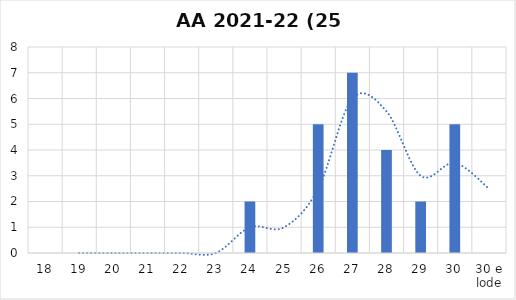
| Category | Series 0 |
|---|---|
| 18 | 0 |
| 19 | 0 |
| 20 | 0 |
| 21 | 0 |
| 22 | 0 |
| 23 | 0 |
| 24 | 2 |
| 25 | 0 |
| 26 | 5 |
| 27 | 7 |
| 28 | 4 |
| 29 | 2 |
| 30 | 5 |
| 30 e lode | 0 |